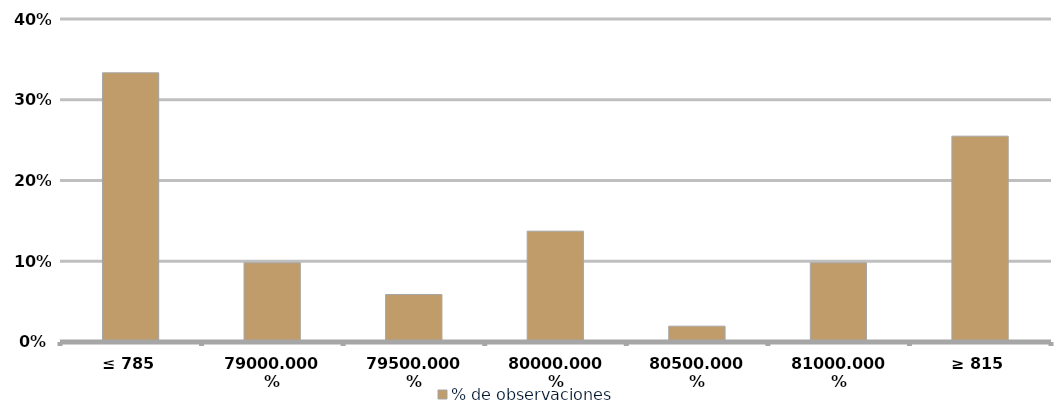
| Category | % de observaciones  |
|---|---|
| ≤ 785 | 0.333 |
| 790 | 0.098 |
| 795 | 0.059 |
| 800 | 0.137 |
| 805 | 0.02 |
| 810 | 0.098 |
| ≥ 815 | 0.255 |